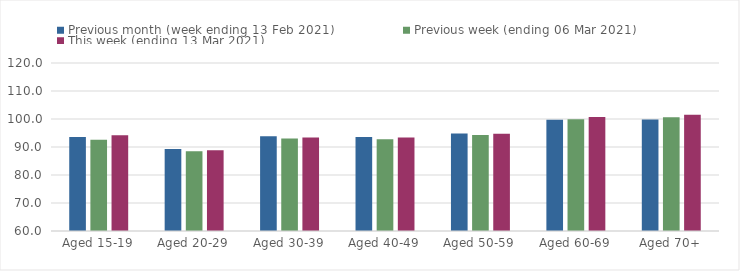
| Category | Previous month (week ending 13 Feb 2021) | Previous week (ending 06 Mar 2021) | This week (ending 13 Mar 2021) |
|---|---|---|---|
| Aged 15-19 | 93.54 | 92.6 | 94.24 |
| Aged 20-29 | 89.25 | 88.44 | 88.8 |
| Aged 30-39 | 93.84 | 93.05 | 93.37 |
| Aged 40-49 | 93.56 | 92.79 | 93.41 |
| Aged 50-59 | 94.81 | 94.25 | 94.76 |
| Aged 60-69 | 99.72 | 99.94 | 100.67 |
| Aged 70+ | 99.85 | 100.66 | 101.56 |